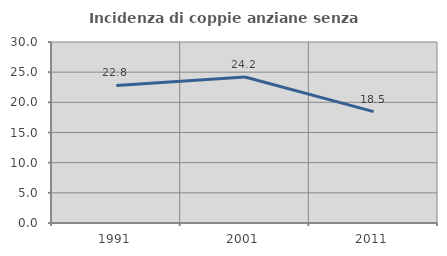
| Category | Incidenza di coppie anziane senza figli  |
|---|---|
| 1991.0 | 22.807 |
| 2001.0 | 24.194 |
| 2011.0 | 18.462 |